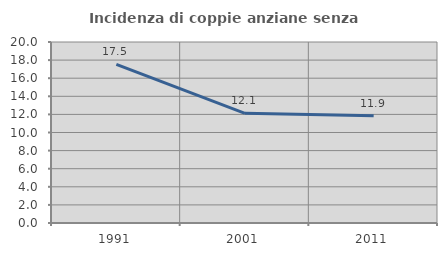
| Category | Incidenza di coppie anziane senza figli  |
|---|---|
| 1991.0 | 17.526 |
| 2001.0 | 12.121 |
| 2011.0 | 11.864 |